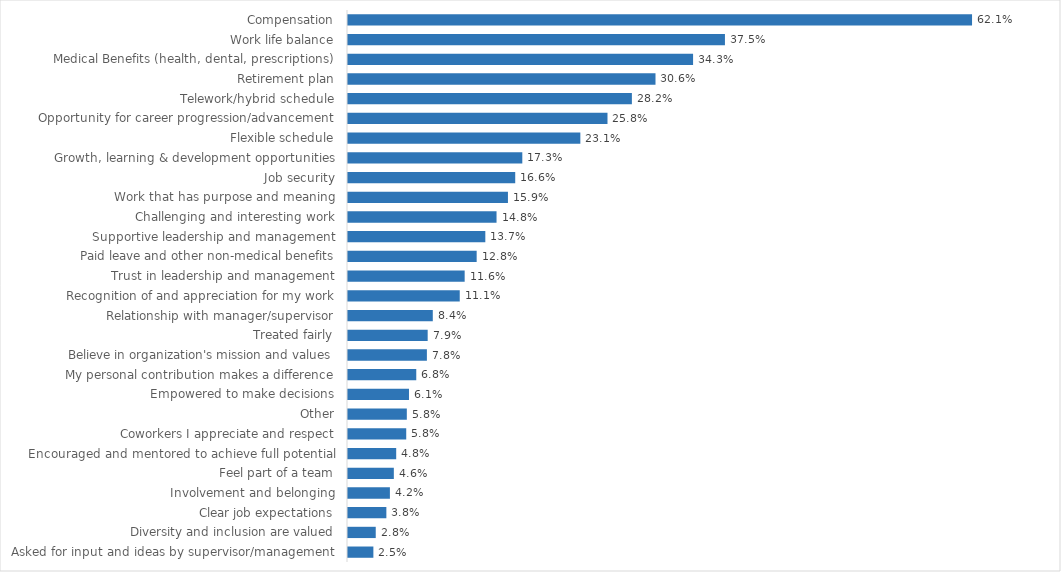
| Category | Statewide Average |
|---|---|
| Compensation | 0.621 |
| Work life balance | 0.375 |
| Medical Benefits (health, dental, prescriptions) | 0.343 |
| Retirement plan | 0.306 |
| Telework/hybrid schedule | 0.282 |
| Opportunity for career progression/advancement | 0.258 |
| Flexible schedule | 0.231 |
| Growth, learning & development opportunities | 0.173 |
| Job security | 0.166 |
| Work that has purpose and meaning | 0.159 |
| Challenging and interesting work | 0.148 |
| Supportive leadership and management | 0.137 |
| Paid leave and other non-medical benefits | 0.128 |
| Trust in leadership and management | 0.116 |
| Recognition of and appreciation for my work | 0.111 |
| Relationship with manager/supervisor | 0.084 |
| Treated fairly | 0.079 |
| Believe in organization's mission and values | 0.078 |
| My personal contribution makes a difference | 0.068 |
| Empowered to make decisions | 0.061 |
| Other | 0.058 |
| Coworkers I appreciate and respect | 0.058 |
| Encouraged and mentored to achieve full potential | 0.048 |
| Feel part of a team | 0.046 |
| Involvement and belonging | 0.042 |
| Clear job expectations | 0.038 |
| Diversity and inclusion are valued | 0.028 |
| Asked for input and ideas by supervisor/management | 0.025 |